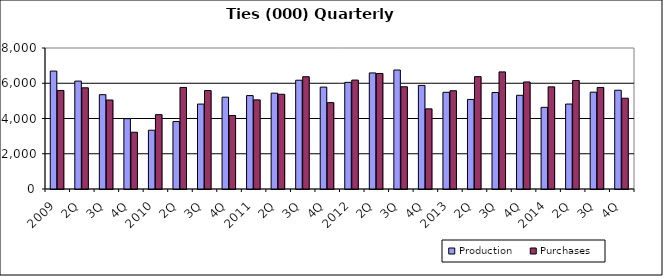
| Category | Production | Purchases |
|---|---|---|
| 2009 | 6691.392 | 5590.76 |
| 2Q | 6123.176 | 5741.405 |
| 3Q | 5351.772 | 5050.331 |
| 4Q | 3989.949 | 3221.559 |
| 2010 | 3333.68 | 4218.678 |
| 2Q | 3827.981 | 5762.886 |
| 3Q | 4818.715 | 5584.917 |
| 4Q | 5209.724 | 4169.501 |
| 2011 | 5299.864 | 5056.504 |
| 2Q | 5437.362 | 5374.245 |
| 3Q | 6171.868 | 6368.887 |
| 4Q | 5780.324 | 4899.945 |
| 2012 | 6051.305 | 6180.123 |
| 2Q | 6584.897 | 6554.489 |
| 3Q | 6750.644 | 5799.695 |
| 4Q | 5877.605 | 4547.244 |
| 2013 | 5487.558 | 5575.07 |
| 2Q | 5082.038 | 6373.523 |
| 3Q | 5474.141 | 6643.033 |
| 4Q | 5316.028 | 6072.825 |
| 2014 | 4632.581 | 5794.828 |
| 2Q | 4819.959 | 6155.525 |
| 3Q | 5493.638 | 5761.13 |
| 4Q | 5603.716 | 5150.074 |